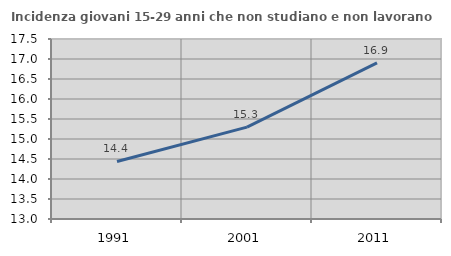
| Category | Incidenza giovani 15-29 anni che non studiano e non lavorano  |
|---|---|
| 1991.0 | 14.439 |
| 2001.0 | 15.297 |
| 2011.0 | 16.905 |